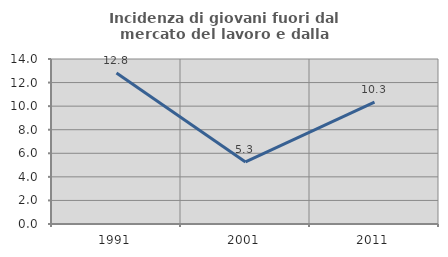
| Category | Incidenza di giovani fuori dal mercato del lavoro e dalla formazione  |
|---|---|
| 1991.0 | 12.821 |
| 2001.0 | 5.263 |
| 2011.0 | 10.345 |